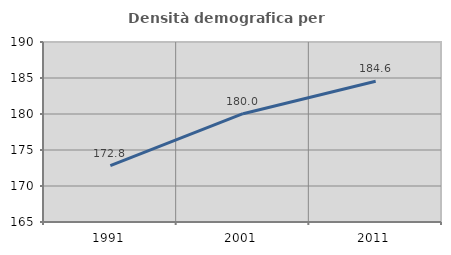
| Category | Densità demografica |
|---|---|
| 1991.0 | 172.823 |
| 2001.0 | 180.04 |
| 2011.0 | 184.555 |